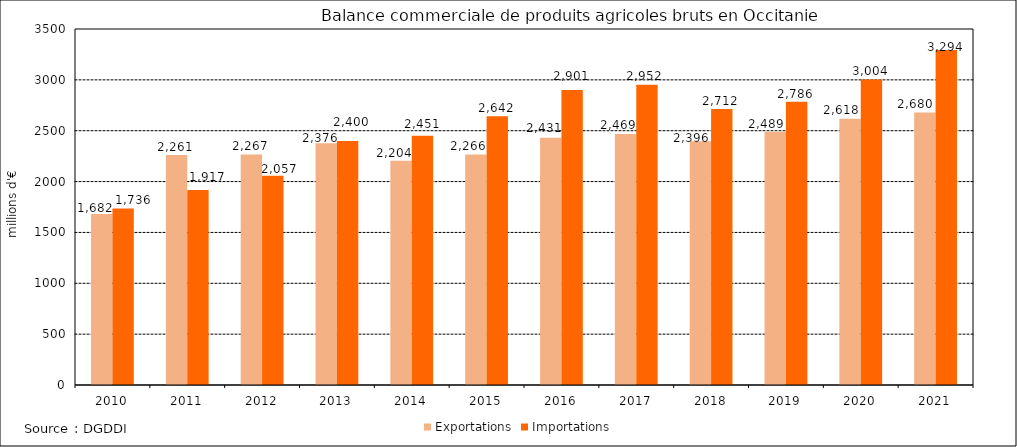
| Category | Exportations | Importations |
|---|---|---|
| 2010.0 | 1681.742 | 1735.92 |
| 2011.0 | 2260.825 | 1917.117 |
| 2012.0 | 2266.642 | 2057.153 |
| 2013.0 | 2376.316 | 2399.829 |
| 2014.0 | 2204.312 | 2450.608 |
| 2015.0 | 2266.438 | 2642.096 |
| 2016.0 | 2431.091 | 2900.739 |
| 2017.0 | 2468.821 | 2952.088 |
| 2018.0 | 2396.28 | 2712.408 |
| 2019.0 | 2489.186 | 2785.557 |
| 2020.0 | 2617.845 | 3004.129 |
| 2021.0 | 2679.85 | 3294.073 |